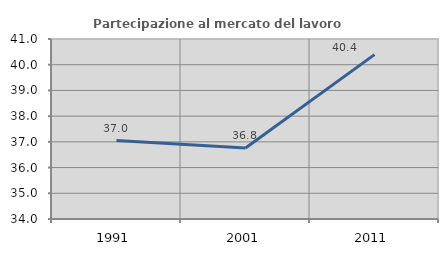
| Category | Partecipazione al mercato del lavoro  femminile |
|---|---|
| 1991.0 | 37.048 |
| 2001.0 | 36.759 |
| 2011.0 | 40.392 |